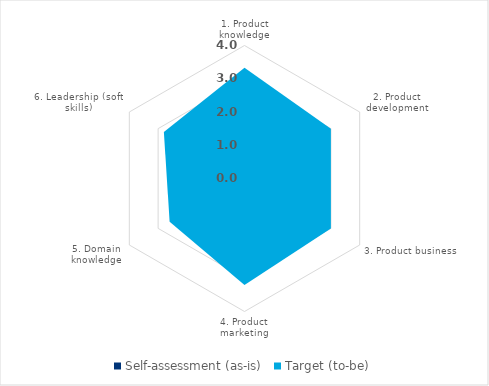
| Category | Self-assessment (as-is) | Target (to-be) |
|---|---|---|
| 1. Product knowledge | 2.667 | 3.333 |
| 2. Product development | 2 | 3 |
| 3. Product business | 1.8 | 3 |
| 4. Product marketing | 2.8 | 3.2 |
| 5. Domain knowledge | 2.4 | 2.6 |
| 6. Leadership (soft skills) | 2.2 | 2.8 |